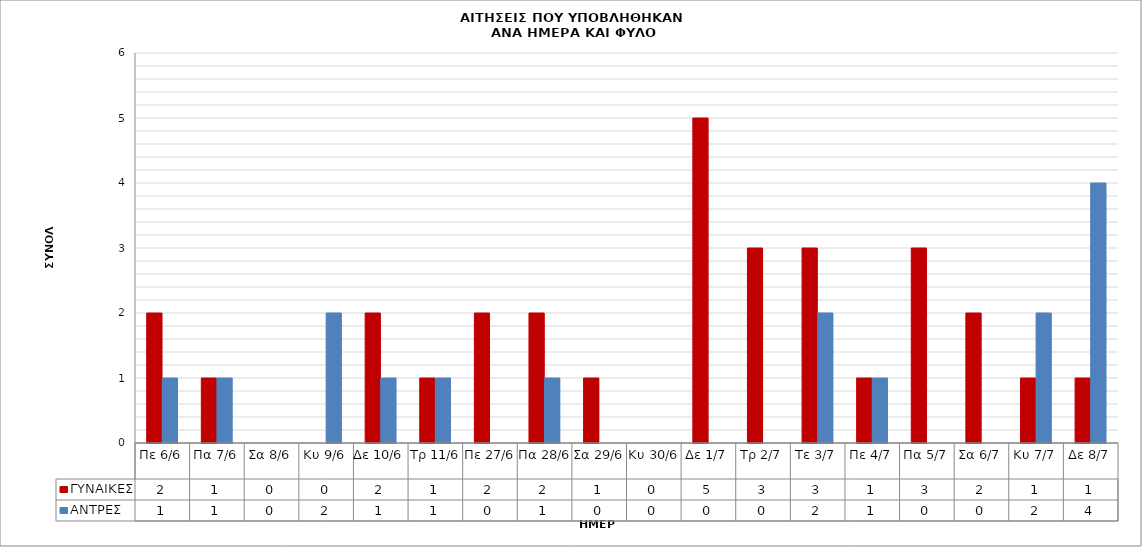
| Category | ΓΥΝΑΙΚΕΣ | ΑΝΤΡΕΣ |
|---|---|---|
| Πε 6/6 | 2 | 1 |
| Πα 7/6 | 1 | 1 |
| Σα 8/6 | 0 | 0 |
| Κυ 9/6 | 0 | 2 |
| Δε 10/6 | 2 | 1 |
| Τρ 11/6 | 1 | 1 |
| Πε 27/6 | 2 | 0 |
| Πα 28/6 | 2 | 1 |
| Σα 29/6 | 1 | 0 |
| Κυ 30/6 | 0 | 0 |
| Δε 1/7 | 5 | 0 |
| Τρ 2/7 | 3 | 0 |
| Τε 3/7 | 3 | 2 |
| Πε 4/7 | 1 | 1 |
| Πα 5/7 | 3 | 0 |
| Σα 6/7 | 2 | 0 |
| Κυ 7/7 | 1 | 2 |
| Δε 8/7 | 1 | 4 |